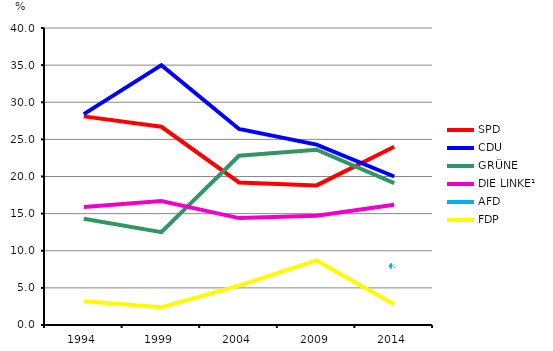
| Category | SPD | CDU | GRÜNE | DIE LINKE¹ | AFD | FDP |
|---|---|---|---|---|---|---|
| 1994.0 | 28.1 | 28.4 | 14.3 | 15.9 | 0 | 3.2 |
| 1999.0 | 26.7 | 35 | 12.5 | 16.7 | 0 | 2.4 |
| 2004.0 | 19.2 | 26.4 | 22.8 | 14.4 | 0 | 5.3 |
| 2009.0 | 18.8 | 24.3 | 23.6 | 14.7 | 0 | 8.7 |
| 2014.0 | 24 | 20 | 19.1 | 16.2 | 7.9 | 2.8 |